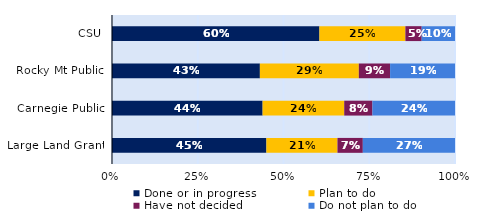
| Category | Done or in progress | Plan to do | Have not decided | Do not plan to do |
|---|---|---|---|---|
| CSU | 0.605 | 0.251 | 0.048 | 0.097 |
| Rocky Mt Public | 0.431 | 0.289 | 0.091 | 0.189 |
| Carnegie Public | 0.439 | 0.238 | 0.082 | 0.241 |
| Large Land Grant | 0.45 | 0.207 | 0.074 | 0.269 |